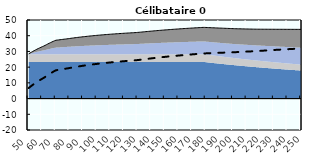
| Category | Coin fiscal moyen (somme des composantes) | Taux moyen d'imposition net en % du salaire brut |
|---|---|---|
| 50.0 | 28.446 | 6.694 |
| 51.0 | 28.985 | 7.396 |
| 52.0 | 29.502 | 8.071 |
| 53.0 | 30 | 8.72 |
| 54.0 | 30.48 | 9.345 |
| 55.0 | 30.942 | 9.948 |
| 56.0 | 31.387 | 10.529 |
| 57.0 | 31.817 | 11.09 |
| 58.0 | 32.232 | 11.631 |
| 59.0 | 32.633 | 12.154 |
| 60.0 | 33.021 | 12.659 |
| 61.0 | 33.396 | 13.148 |
| 62.0 | 33.822 | 13.704 |
| 63.0 | 34.287 | 14.31 |
| 64.0 | 34.737 | 14.898 |
| 65.0 | 35.174 | 15.467 |
| 66.0 | 35.597 | 16.019 |
| 67.0 | 36.008 | 16.554 |
| 68.0 | 36.406 | 17.074 |
| 69.0 | 36.793 | 17.579 |
| 70.0 | 37.119 | 18.004 |
| 71.0 | 37.224 | 18.14 |
| 72.0 | 37.326 | 18.272 |
| 73.0 | 37.44 | 18.422 |
| 74.0 | 37.557 | 18.574 |
| 75.0 | 37.67 | 18.721 |
| 76.0 | 37.78 | 18.865 |
| 77.0 | 37.887 | 19.005 |
| 78.0 | 37.992 | 19.142 |
| 79.0 | 38.108 | 19.293 |
| 80.0 | 38.234 | 19.458 |
| 81.0 | 38.358 | 19.618 |
| 82.0 | 38.478 | 19.775 |
| 83.0 | 38.595 | 19.928 |
| 84.0 | 38.709 | 20.077 |
| 85.0 | 38.821 | 20.222 |
| 86.0 | 38.93 | 20.365 |
| 87.0 | 39.037 | 20.504 |
| 88.0 | 39.141 | 20.64 |
| 89.0 | 39.243 | 20.772 |
| 90.0 | 39.342 | 20.902 |
| 91.0 | 39.439 | 21.029 |
| 92.0 | 39.535 | 21.153 |
| 93.0 | 39.628 | 21.275 |
| 94.0 | 39.719 | 21.394 |
| 95.0 | 39.808 | 21.51 |
| 96.0 | 39.896 | 21.624 |
| 97.0 | 39.982 | 21.736 |
| 98.0 | 40.065 | 21.845 |
| 99.0 | 40.148 | 21.953 |
| 100.0 | 40.228 | 22.058 |
| 101.0 | 40.307 | 22.161 |
| 102.0 | 40.385 | 22.262 |
| 103.0 | 40.46 | 22.36 |
| 104.0 | 40.535 | 22.458 |
| 105.0 | 40.608 | 22.553 |
| 106.0 | 40.68 | 22.646 |
| 107.0 | 40.75 | 22.738 |
| 108.0 | 40.819 | 22.828 |
| 109.0 | 40.887 | 22.916 |
| 110.0 | 40.953 | 23.003 |
| 111.0 | 41.019 | 23.088 |
| 112.0 | 41.083 | 23.172 |
| 113.0 | 41.146 | 23.254 |
| 114.0 | 41.208 | 23.335 |
| 115.0 | 41.268 | 23.414 |
| 116.0 | 41.328 | 23.492 |
| 117.0 | 41.387 | 23.569 |
| 118.0 | 41.445 | 23.644 |
| 119.0 | 41.502 | 23.718 |
| 120.0 | 41.557 | 23.791 |
| 121.0 | 41.612 | 23.862 |
| 122.0 | 41.666 | 23.933 |
| 123.0 | 41.719 | 24.002 |
| 124.0 | 41.772 | 24.07 |
| 125.0 | 41.823 | 24.137 |
| 126.0 | 41.874 | 24.203 |
| 127.0 | 41.924 | 24.268 |
| 128.0 | 41.973 | 24.332 |
| 129.0 | 42.033 | 24.411 |
| 130.0 | 42.106 | 24.506 |
| 131.0 | 42.177 | 24.599 |
| 132.0 | 42.257 | 24.704 |
| 133.0 | 42.346 | 24.819 |
| 134.0 | 42.433 | 24.932 |
| 135.0 | 42.519 | 25.044 |
| 136.0 | 42.603 | 25.154 |
| 137.0 | 42.686 | 25.263 |
| 138.0 | 42.769 | 25.37 |
| 139.0 | 42.849 | 25.476 |
| 140.0 | 42.929 | 25.58 |
| 141.0 | 43.008 | 25.682 |
| 142.0 | 43.085 | 25.783 |
| 143.0 | 43.162 | 25.883 |
| 144.0 | 43.237 | 25.981 |
| 145.0 | 43.311 | 26.078 |
| 146.0 | 43.385 | 26.174 |
| 147.0 | 43.457 | 26.268 |
| 148.0 | 43.528 | 26.361 |
| 149.0 | 43.599 | 26.453 |
| 150.0 | 43.668 | 26.543 |
| 151.0 | 43.737 | 26.633 |
| 152.0 | 43.804 | 26.721 |
| 153.0 | 43.871 | 26.808 |
| 154.0 | 43.937 | 26.894 |
| 155.0 | 44.002 | 26.978 |
| 156.0 | 44.066 | 27.062 |
| 157.0 | 44.129 | 27.145 |
| 158.0 | 44.192 | 27.226 |
| 159.0 | 44.254 | 27.307 |
| 160.0 | 44.315 | 27.386 |
| 161.0 | 44.375 | 27.465 |
| 162.0 | 44.435 | 27.543 |
| 163.0 | 44.493 | 27.619 |
| 164.0 | 44.551 | 27.695 |
| 165.0 | 44.609 | 27.77 |
| 166.0 | 44.665 | 27.844 |
| 167.0 | 44.721 | 27.917 |
| 168.0 | 44.777 | 27.989 |
| 169.0 | 44.831 | 28.06 |
| 170.0 | 44.885 | 28.13 |
| 171.0 | 44.939 | 28.2 |
| 172.0 | 44.991 | 28.269 |
| 173.0 | 45.044 | 28.337 |
| 174.0 | 45.095 | 28.404 |
| 175.0 | 45.146 | 28.471 |
| 176.0 | 45.197 | 28.536 |
| 177.0 | 45.246 | 28.601 |
| 178.0 | 45.296 | 28.665 |
| 179.0 | 45.292 | 28.715 |
| 180.0 | 45.252 | 28.755 |
| 181.0 | 45.212 | 28.795 |
| 182.0 | 45.172 | 28.834 |
| 183.0 | 45.133 | 28.872 |
| 184.0 | 45.095 | 28.911 |
| 185.0 | 45.056 | 28.948 |
| 186.0 | 45.018 | 28.986 |
| 187.0 | 44.98 | 29.023 |
| 188.0 | 44.943 | 29.059 |
| 189.0 | 44.906 | 29.095 |
| 190.0 | 44.869 | 29.131 |
| 191.0 | 44.832 | 29.167 |
| 192.0 | 44.796 | 29.202 |
| 193.0 | 44.76 | 29.237 |
| 194.0 | 44.724 | 29.271 |
| 195.0 | 44.689 | 29.305 |
| 196.0 | 44.654 | 29.339 |
| 197.0 | 44.619 | 29.372 |
| 198.0 | 44.584 | 29.405 |
| 199.0 | 44.55 | 29.437 |
| 200.0 | 44.516 | 29.47 |
| 201.0 | 44.482 | 29.502 |
| 202.0 | 44.449 | 29.534 |
| 203.0 | 44.428 | 29.58 |
| 204.0 | 44.407 | 29.626 |
| 205.0 | 44.386 | 29.672 |
| 206.0 | 44.365 | 29.717 |
| 207.0 | 44.345 | 29.762 |
| 208.0 | 44.324 | 29.807 |
| 209.0 | 44.304 | 29.851 |
| 210.0 | 44.284 | 29.894 |
| 211.0 | 44.264 | 29.937 |
| 212.0 | 44.244 | 29.98 |
| 213.0 | 44.225 | 30.022 |
| 214.0 | 44.205 | 30.064 |
| 215.0 | 44.186 | 30.106 |
| 216.0 | 44.167 | 30.147 |
| 217.0 | 44.154 | 30.196 |
| 218.0 | 44.15 | 30.255 |
| 219.0 | 44.146 | 30.313 |
| 220.0 | 44.141 | 30.371 |
| 221.0 | 44.137 | 30.428 |
| 222.0 | 44.133 | 30.485 |
| 223.0 | 44.129 | 30.541 |
| 224.0 | 44.125 | 30.596 |
| 225.0 | 44.121 | 30.651 |
| 226.0 | 44.117 | 30.706 |
| 227.0 | 44.113 | 30.76 |
| 228.0 | 44.109 | 30.814 |
| 229.0 | 44.105 | 30.867 |
| 230.0 | 44.101 | 30.92 |
| 231.0 | 44.097 | 30.972 |
| 232.0 | 44.094 | 31.024 |
| 233.0 | 44.09 | 31.075 |
| 234.0 | 44.086 | 31.126 |
| 235.0 | 44.082 | 31.177 |
| 236.0 | 44.079 | 31.227 |
| 237.0 | 44.075 | 31.277 |
| 238.0 | 44.071 | 31.326 |
| 239.0 | 44.068 | 31.375 |
| 240.0 | 44.064 | 31.423 |
| 241.0 | 44.06 | 31.471 |
| 242.0 | 44.057 | 31.519 |
| 243.0 | 44.053 | 31.566 |
| 244.0 | 44.05 | 31.613 |
| 245.0 | 44.046 | 31.659 |
| 246.0 | 44.043 | 31.706 |
| 247.0 | 44.039 | 31.751 |
| 248.0 | 44.036 | 31.797 |
| 249.0 | 44.032 | 31.842 |
| 250.0 | 44.029 | 31.886 |